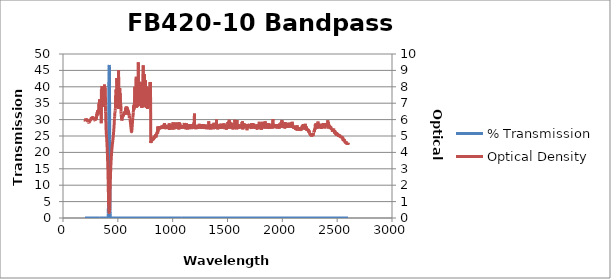
| Category | % Transmission |
|---|---|
| 2600.0 | 0.003 |
| 2599.0 | 0.003 |
| 2598.0 | 0.003 |
| 2597.0 | 0.003 |
| 2596.0 | 0.003 |
| 2595.0 | 0.003 |
| 2594.0 | 0.003 |
| 2593.0 | 0.003 |
| 2592.0 | 0.003 |
| 2591.0 | 0.003 |
| 2590.0 | 0.003 |
| 2589.0 | 0.003 |
| 2588.0 | 0.003 |
| 2587.0 | 0.003 |
| 2586.0 | 0.003 |
| 2585.0 | 0.003 |
| 2584.0 | 0.003 |
| 2583.0 | 0.003 |
| 2582.0 | 0.002 |
| 2581.0 | 0.002 |
| 2580.0 | 0.002 |
| 2579.0 | 0.003 |
| 2578.0 | 0.002 |
| 2577.0 | 0.003 |
| 2576.0 | 0.002 |
| 2575.0 | 0.003 |
| 2574.0 | 0.002 |
| 2573.0 | 0.002 |
| 2572.0 | 0.002 |
| 2571.0 | 0.002 |
| 2570.0 | 0.002 |
| 2569.0 | 0.002 |
| 2568.0 | 0.002 |
| 2567.0 | 0.002 |
| 2566.0 | 0.002 |
| 2565.0 | 0.002 |
| 2564.0 | 0.002 |
| 2563.0 | 0.002 |
| 2562.0 | 0.002 |
| 2561.0 | 0.002 |
| 2560.0 | 0.002 |
| 2559.0 | 0.002 |
| 2558.0 | 0.002 |
| 2557.0 | 0.002 |
| 2556.0 | 0.001 |
| 2555.0 | 0.001 |
| 2554.0 | 0.002 |
| 2553.0 | 0.001 |
| 2552.0 | 0.002 |
| 2551.0 | 0.002 |
| 2550.0 | 0.002 |
| 2549.0 | 0.001 |
| 2548.0 | 0.001 |
| 2547.0 | 0.001 |
| 2546.0 | 0.001 |
| 2545.0 | 0.001 |
| 2544.0 | 0.001 |
| 2543.0 | 0.001 |
| 2542.0 | 0.001 |
| 2541.0 | 0.001 |
| 2540.0 | 0.001 |
| 2539.0 | 0.001 |
| 2538.0 | 0.001 |
| 2537.0 | 0.001 |
| 2536.0 | 0.001 |
| 2535.0 | 0.001 |
| 2534.0 | 0.001 |
| 2533.0 | 0.001 |
| 2532.0 | 0.001 |
| 2531.0 | 0.001 |
| 2530.0 | 0.001 |
| 2529.0 | 0.001 |
| 2528.0 | 0.001 |
| 2527.0 | 0.001 |
| 2526.0 | 0.001 |
| 2525.0 | 0.001 |
| 2524.0 | 0.001 |
| 2523.0 | 0.001 |
| 2522.0 | 0.001 |
| 2521.0 | 0.001 |
| 2520.0 | 0.001 |
| 2519.0 | 0.001 |
| 2518.0 | 0.001 |
| 2517.0 | 0.001 |
| 2516.0 | 0.001 |
| 2515.0 | 0.001 |
| 2514.0 | 0.001 |
| 2513.0 | 0.001 |
| 2512.0 | 0.001 |
| 2511.0 | 0.001 |
| 2510.0 | 0.001 |
| 2509.0 | 0.001 |
| 2508.0 | 0.001 |
| 2507.0 | 0.001 |
| 2506.0 | 0.001 |
| 2505.0 | 0.001 |
| 2504.0 | 0.001 |
| 2503.0 | 0.001 |
| 2502.0 | 0.001 |
| 2501.0 | 0.001 |
| 2500.0 | 0.001 |
| 2499.0 | 0.001 |
| 2498.0 | 0.001 |
| 2497.0 | 0.001 |
| 2496.0 | 0.001 |
| 2495.0 | 0.001 |
| 2494.0 | 0.001 |
| 2493.0 | 0.001 |
| 2492.0 | 0.001 |
| 2491.0 | 0.001 |
| 2490.0 | 0.001 |
| 2489.0 | 0.001 |
| 2488.0 | 0.001 |
| 2487.0 | 0.001 |
| 2486.0 | 0.001 |
| 2485.0 | 0.001 |
| 2484.0 | 0.001 |
| 2483.0 | 0.001 |
| 2482.0 | 0.001 |
| 2481.0 | 0.001 |
| 2480.0 | 0.001 |
| 2479.0 | 0.001 |
| 2478.0 | 0 |
| 2477.0 | 0 |
| 2476.0 | 0.001 |
| 2475.0 | 0.001 |
| 2474.0 | 0 |
| 2473.0 | 0 |
| 2472.0 | 0.001 |
| 2471.0 | 0.001 |
| 2470.0 | 0 |
| 2469.0 | 0.001 |
| 2468.0 | 0 |
| 2467.0 | 0 |
| 2466.0 | 0.001 |
| 2465.0 | 0 |
| 2464.0 | 0 |
| 2463.0 | 0 |
| 2462.0 | 0 |
| 2461.0 | 0.001 |
| 2460.0 | 0.001 |
| 2459.0 | 0 |
| 2458.0 | 0.001 |
| 2457.0 | 0 |
| 2456.0 | 0 |
| 2455.0 | 0 |
| 2454.0 | 0 |
| 2453.0 | 0 |
| 2452.0 | 0 |
| 2451.0 | 0 |
| 2450.0 | 0 |
| 2449.0 | 0 |
| 2448.0 | 0 |
| 2447.0 | 0 |
| 2446.0 | 0 |
| 2445.0 | 0 |
| 2444.0 | 0 |
| 2443.0 | 0 |
| 2442.0 | 0 |
| 2441.0 | 0 |
| 2440.0 | 0 |
| 2439.0 | 0 |
| 2438.0 | 0 |
| 2437.0 | 0 |
| 2436.0 | 0 |
| 2435.0 | 0 |
| 2434.0 | 0 |
| 2433.0 | 0 |
| 2432.0 | 0 |
| 2431.0 | 0 |
| 2430.0 | 0 |
| 2429.0 | 0 |
| 2428.0 | 0 |
| 2427.0 | 0 |
| 2426.0 | 0 |
| 2425.0 | 0 |
| 2424.0 | 0 |
| 2423.0 | 0 |
| 2422.0 | 0 |
| 2421.0 | 0 |
| 2420.0 | 0 |
| 2419.0 | 0 |
| 2418.0 | 0 |
| 2417.0 | 0 |
| 2416.0 | 0 |
| 2415.0 | 0 |
| 2414.0 | 0 |
| 2413.0 | 0 |
| 2412.0 | 0 |
| 2411.0 | 0 |
| 2410.0 | 0 |
| 2409.0 | 0 |
| 2408.0 | 0 |
| 2407.0 | 0 |
| 2406.0 | 0 |
| 2405.0 | 0 |
| 2404.0 | 0 |
| 2403.0 | 0 |
| 2402.0 | 0 |
| 2401.0 | 0 |
| 2400.0 | 0 |
| 2399.0 | 0 |
| 2398.0 | 0 |
| 2397.0 | 0 |
| 2396.0 | 0 |
| 2395.0 | 0 |
| 2394.0 | 0 |
| 2393.0 | 0 |
| 2392.0 | 0 |
| 2391.0 | 0 |
| 2390.0 | 0 |
| 2389.0 | 0 |
| 2388.0 | 0 |
| 2387.0 | 0 |
| 2386.0 | 0 |
| 2385.0 | 0 |
| 2384.0 | 0 |
| 2383.0 | 0 |
| 2382.0 | 0 |
| 2381.0 | 0 |
| 2380.0 | 0 |
| 2379.0 | 0 |
| 2378.0 | 0 |
| 2377.0 | 0 |
| 2376.0 | 0 |
| 2375.0 | 0 |
| 2374.0 | 0 |
| 2373.0 | 0 |
| 2372.0 | 0 |
| 2371.0 | 0 |
| 2370.0 | 0 |
| 2369.0 | 0 |
| 2368.0 | 0 |
| 2367.0 | 0 |
| 2366.0 | 0 |
| 2365.0 | 0 |
| 2364.0 | 0 |
| 2363.0 | 0 |
| 2362.0 | 0 |
| 2361.0 | 0 |
| 2360.0 | 0 |
| 2359.0 | 0 |
| 2358.0 | 0 |
| 2357.0 | 0 |
| 2356.0 | 0 |
| 2355.0 | 0 |
| 2354.0 | 0 |
| 2353.0 | 0 |
| 2352.0 | 0 |
| 2351.0 | 0 |
| 2350.0 | 0 |
| 2349.0 | 0 |
| 2348.0 | 0 |
| 2347.0 | 0 |
| 2346.0 | 0 |
| 2345.0 | 0 |
| 2344.0 | 0 |
| 2343.0 | 0 |
| 2342.0 | 0 |
| 2341.0 | 0 |
| 2340.0 | 0 |
| 2339.0 | 0 |
| 2338.0 | 0 |
| 2337.0 | 0 |
| 2336.0 | 0 |
| 2335.0 | 0 |
| 2334.0 | 0 |
| 2333.0 | 0 |
| 2332.0 | 0 |
| 2331.0 | 0 |
| 2330.0 | 0 |
| 2329.0 | 0 |
| 2328.0 | 0 |
| 2327.0 | 0 |
| 2326.0 | 0 |
| 2325.0 | 0 |
| 2324.0 | 0 |
| 2323.0 | 0 |
| 2322.0 | 0 |
| 2321.0 | 0 |
| 2320.0 | 0 |
| 2319.0 | 0 |
| 2318.0 | 0 |
| 2317.0 | 0 |
| 2316.0 | 0 |
| 2315.0 | 0 |
| 2314.0 | 0 |
| 2313.0 | 0 |
| 2312.0 | 0 |
| 2311.0 | 0 |
| 2310.0 | 0 |
| 2309.0 | 0 |
| 2308.0 | 0 |
| 2307.0 | 0 |
| 2306.0 | 0 |
| 2305.0 | 0 |
| 2304.0 | 0 |
| 2303.0 | 0 |
| 2302.0 | 0 |
| 2301.0 | 0 |
| 2300.0 | 0 |
| 2299.0 | 0 |
| 2298.0 | 0 |
| 2297.0 | 0 |
| 2296.0 | 0 |
| 2295.0 | 0 |
| 2294.0 | 0 |
| 2293.0 | 0.001 |
| 2292.0 | 0 |
| 2291.0 | 0 |
| 2290.0 | 0.001 |
| 2289.0 | 0.001 |
| 2288.0 | 0.001 |
| 2287.0 | 0.001 |
| 2286.0 | 0.001 |
| 2285.0 | 0.001 |
| 2284.0 | 0.001 |
| 2283.0 | 0.001 |
| 2282.0 | 0.001 |
| 2281.0 | 0.001 |
| 2280.0 | 0.001 |
| 2279.0 | 0.001 |
| 2278.0 | 0.001 |
| 2277.0 | 0.001 |
| 2276.0 | 0.001 |
| 2275.0 | 0.001 |
| 2274.0 | 0.001 |
| 2273.0 | 0.001 |
| 2272.0 | 0.001 |
| 2271.0 | 0.001 |
| 2270.0 | 0.001 |
| 2269.0 | 0.001 |
| 2268.0 | 0.001 |
| 2267.0 | 0.001 |
| 2266.0 | 0.001 |
| 2265.0 | 0.001 |
| 2264.0 | 0.001 |
| 2263.0 | 0.001 |
| 2262.0 | 0.001 |
| 2261.0 | 0.001 |
| 2260.0 | 0.001 |
| 2259.0 | 0.001 |
| 2258.0 | 0.001 |
| 2257.0 | 0.001 |
| 2256.0 | 0.001 |
| 2255.0 | 0.001 |
| 2254.0 | 0.001 |
| 2253.0 | 0.001 |
| 2252.0 | 0.001 |
| 2251.0 | 0.001 |
| 2250.0 | 0.001 |
| 2249.0 | 0.001 |
| 2248.0 | 0.001 |
| 2247.0 | 0.001 |
| 2246.0 | 0.001 |
| 2245.0 | 0.001 |
| 2244.0 | 0.001 |
| 2243.0 | 0.001 |
| 2242.0 | 0.001 |
| 2241.0 | 0 |
| 2240.0 | 0.001 |
| 2239.0 | 0.001 |
| 2238.0 | 0.001 |
| 2237.0 | 0 |
| 2236.0 | 0 |
| 2235.0 | 0 |
| 2234.0 | 0 |
| 2233.0 | 0 |
| 2232.0 | 0.001 |
| 2231.0 | 0 |
| 2230.0 | 0 |
| 2229.0 | 0 |
| 2228.0 | 0 |
| 2227.0 | 0 |
| 2226.0 | 0 |
| 2225.0 | 0 |
| 2224.0 | 0 |
| 2223.0 | 0 |
| 2222.0 | 0 |
| 2221.0 | 0 |
| 2220.0 | 0 |
| 2219.0 | 0 |
| 2218.0 | 0 |
| 2217.0 | 0 |
| 2216.0 | 0 |
| 2215.0 | 0 |
| 2214.0 | 0 |
| 2213.0 | 0 |
| 2212.0 | 0 |
| 2211.0 | 0 |
| 2210.0 | 0 |
| 2209.0 | 0 |
| 2208.0 | 0 |
| 2207.0 | 0 |
| 2206.0 | 0 |
| 2205.0 | 0 |
| 2204.0 | 0 |
| 2203.0 | 0 |
| 2202.0 | 0 |
| 2201.0 | 0 |
| 2200.0 | 0 |
| 2199.0 | 0 |
| 2198.0 | 0 |
| 2197.0 | 0 |
| 2196.0 | 0 |
| 2195.0 | 0 |
| 2194.0 | 0 |
| 2193.0 | 0 |
| 2192.0 | 0 |
| 2191.0 | 0 |
| 2190.0 | 0 |
| 2189.0 | 0 |
| 2188.0 | 0 |
| 2187.0 | 0 |
| 2186.0 | 0 |
| 2185.0 | 0 |
| 2184.0 | 0 |
| 2183.0 | 0 |
| 2182.0 | 0 |
| 2181.0 | 0 |
| 2180.0 | 0 |
| 2179.0 | 0 |
| 2178.0 | 0 |
| 2177.0 | 0 |
| 2176.0 | 0 |
| 2175.0 | 0 |
| 2174.0 | 0 |
| 2173.0 | 0 |
| 2172.0 | 0 |
| 2171.0 | 0 |
| 2170.0 | 0 |
| 2169.0 | 0 |
| 2168.0 | 0 |
| 2167.0 | 0 |
| 2166.0 | 0 |
| 2165.0 | 0 |
| 2164.0 | 0 |
| 2163.0 | 0 |
| 2162.0 | 0 |
| 2161.0 | 0 |
| 2160.0 | 0 |
| 2159.0 | 0 |
| 2158.0 | 0 |
| 2157.0 | 0 |
| 2156.0 | 0 |
| 2155.0 | 0 |
| 2154.0 | 0 |
| 2153.0 | 0 |
| 2152.0 | 0 |
| 2151.0 | 0 |
| 2150.0 | 0 |
| 2149.0 | 0 |
| 2148.0 | 0 |
| 2147.0 | 0 |
| 2146.0 | 0 |
| 2145.0 | 0 |
| 2144.0 | 0 |
| 2143.0 | 0 |
| 2142.0 | 0 |
| 2141.0 | 0 |
| 2140.0 | 0 |
| 2139.0 | 0 |
| 2138.0 | 0 |
| 2137.0 | 0 |
| 2136.0 | 0 |
| 2135.0 | 0 |
| 2134.0 | 0 |
| 2133.0 | 0 |
| 2132.0 | 0 |
| 2131.0 | 0 |
| 2130.0 | 0 |
| 2129.0 | 0 |
| 2128.0 | 0 |
| 2127.0 | 0 |
| 2126.0 | 0 |
| 2125.0 | 0 |
| 2124.0 | 0 |
| 2123.0 | 0 |
| 2122.0 | 0 |
| 2121.0 | 0 |
| 2120.0 | 0 |
| 2119.0 | 0 |
| 2118.0 | 0 |
| 2117.0 | 0 |
| 2116.0 | 0 |
| 2115.0 | 0 |
| 2114.0 | 0 |
| 2113.0 | 0 |
| 2112.0 | 0 |
| 2111.0 | 0 |
| 2110.0 | 0 |
| 2109.0 | 0 |
| 2108.0 | 0 |
| 2107.0 | 0 |
| 2106.0 | 0 |
| 2105.0 | 0 |
| 2104.0 | 0 |
| 2103.0 | 0 |
| 2102.0 | 0 |
| 2101.0 | 0 |
| 2100.0 | 0 |
| 2099.0 | 0 |
| 2098.0 | 0 |
| 2097.0 | 0 |
| 2096.0 | 0 |
| 2095.0 | 0 |
| 2094.0 | 0 |
| 2093.0 | 0 |
| 2092.0 | 0 |
| 2091.0 | 0 |
| 2090.0 | 0 |
| 2089.0 | 0 |
| 2088.0 | 0 |
| 2087.0 | 0 |
| 2086.0 | 0 |
| 2085.0 | 0 |
| 2084.0 | 0 |
| 2083.0 | 0 |
| 2082.0 | 0 |
| 2081.0 | 0 |
| 2080.0 | 0 |
| 2079.0 | 0 |
| 2078.0 | 0 |
| 2077.0 | 0 |
| 2076.0 | 0 |
| 2075.0 | 0 |
| 2074.0 | 0 |
| 2073.0 | 0 |
| 2072.0 | 0 |
| 2071.0 | 0 |
| 2070.0 | 0 |
| 2069.0 | 0 |
| 2068.0 | 0 |
| 2067.0 | 0 |
| 2066.0 | 0 |
| 2065.0 | 0 |
| 2064.0 | 0 |
| 2063.0 | 0 |
| 2062.0 | 0 |
| 2061.0 | 0 |
| 2060.0 | 0 |
| 2059.0 | 0 |
| 2058.0 | 0 |
| 2057.0 | 0 |
| 2056.0 | 0 |
| 2055.0 | 0 |
| 2054.0 | 0 |
| 2053.0 | 0 |
| 2052.0 | 0 |
| 2051.0 | 0 |
| 2050.0 | 0 |
| 2049.0 | 0 |
| 2048.0 | 0 |
| 2047.0 | 0 |
| 2046.0 | 0 |
| 2045.0 | 0 |
| 2044.0 | 0 |
| 2043.0 | 0 |
| 2042.0 | 0 |
| 2041.0 | 0 |
| 2040.0 | 0 |
| 2039.0 | 0 |
| 2038.0 | 0 |
| 2037.0 | 0 |
| 2036.0 | 0 |
| 2035.0 | 0 |
| 2034.0 | 0 |
| 2033.0 | 0 |
| 2032.0 | 0 |
| 2031.0 | 0 |
| 2030.0 | 0 |
| 2029.0 | 0 |
| 2028.0 | 0 |
| 2027.0 | 0 |
| 2026.0 | 0 |
| 2025.0 | 0 |
| 2024.0 | 0 |
| 2023.0 | 0 |
| 2022.0 | 0 |
| 2021.0 | 0 |
| 2020.0 | 0 |
| 2019.0 | 0 |
| 2018.0 | 0 |
| 2017.0 | 0 |
| 2016.0 | 0 |
| 2015.0 | 0 |
| 2014.0 | 0 |
| 2013.0 | 0 |
| 2012.0 | 0 |
| 2011.0 | 0 |
| 2010.0 | 0 |
| 2009.0 | 0 |
| 2008.0 | 0 |
| 2007.0 | 0 |
| 2006.0 | 0 |
| 2005.0 | 0 |
| 2004.0 | 0 |
| 2003.0 | 0 |
| 2002.0 | 0 |
| 2001.0 | 0 |
| 2000.0 | 0 |
| 1999.0 | 0 |
| 1998.0 | 0 |
| 1997.0 | 0 |
| 1996.0 | 0 |
| 1995.0 | 0 |
| 1994.0 | 0 |
| 1993.0 | 0 |
| 1992.0 | 0 |
| 1991.0 | 0 |
| 1990.0 | 0 |
| 1989.0 | 0 |
| 1988.0 | 0 |
| 1987.0 | 0 |
| 1986.0 | 0 |
| 1985.0 | 0 |
| 1984.0 | 0 |
| 1983.0 | 0 |
| 1982.0 | 0 |
| 1981.0 | 0 |
| 1980.0 | 0 |
| 1979.0 | 0 |
| 1978.0 | 0 |
| 1977.0 | 0 |
| 1976.0 | 0 |
| 1975.0 | 0 |
| 1974.0 | 0 |
| 1973.0 | 0 |
| 1972.0 | 0 |
| 1971.0 | 0 |
| 1970.0 | 0 |
| 1969.0 | 0 |
| 1968.0 | 0 |
| 1967.0 | 0 |
| 1966.0 | 0 |
| 1965.0 | 0 |
| 1964.0 | 0 |
| 1963.0 | 0 |
| 1962.0 | 0 |
| 1961.0 | 0 |
| 1960.0 | 0 |
| 1959.0 | 0 |
| 1958.0 | 0 |
| 1957.0 | 0 |
| 1956.0 | 0 |
| 1955.0 | 0 |
| 1954.0 | 0 |
| 1953.0 | 0 |
| 1952.0 | 0 |
| 1951.0 | 0 |
| 1950.0 | 0 |
| 1949.0 | 0 |
| 1948.0 | 0 |
| 1947.0 | 0 |
| 1946.0 | 0 |
| 1945.0 | 0 |
| 1944.0 | 0 |
| 1943.0 | 0 |
| 1942.0 | 0 |
| 1941.0 | 0 |
| 1940.0 | 0 |
| 1939.0 | 0 |
| 1938.0 | 0 |
| 1937.0 | 0 |
| 1936.0 | 0 |
| 1935.0 | 0 |
| 1934.0 | 0 |
| 1933.0 | 0 |
| 1932.0 | 0 |
| 1931.0 | 0 |
| 1930.0 | 0 |
| 1929.0 | 0 |
| 1928.0 | 0 |
| 1927.0 | 0 |
| 1926.0 | 0 |
| 1925.0 | 0 |
| 1924.0 | 0 |
| 1923.0 | 0 |
| 1922.0 | 0 |
| 1921.0 | 0 |
| 1920.0 | 0 |
| 1919.0 | 0 |
| 1918.0 | 0 |
| 1917.0 | 0 |
| 1916.0 | 0 |
| 1915.0 | 0 |
| 1914.0 | 0 |
| 1913.0 | 0 |
| 1912.0 | 0 |
| 1911.0 | 0 |
| 1910.0 | 0 |
| 1909.0 | 0 |
| 1908.0 | 0 |
| 1907.0 | 0 |
| 1906.0 | 0 |
| 1905.0 | 0 |
| 1904.0 | 0 |
| 1903.0 | 0 |
| 1902.0 | 0 |
| 1901.0 | 0 |
| 1900.0 | 0 |
| 1899.0 | 0 |
| 1898.0 | 0 |
| 1897.0 | 0 |
| 1896.0 | 0 |
| 1895.0 | 0 |
| 1894.0 | 0 |
| 1893.0 | 0 |
| 1892.0 | 0 |
| 1891.0 | 0 |
| 1890.0 | 0 |
| 1889.0 | 0 |
| 1888.0 | 0 |
| 1887.0 | 0 |
| 1886.0 | 0 |
| 1885.0 | 0 |
| 1884.0 | 0 |
| 1883.0 | 0 |
| 1882.0 | 0 |
| 1881.0 | 0 |
| 1880.0 | 0 |
| 1879.0 | 0 |
| 1878.0 | 0 |
| 1877.0 | 0 |
| 1876.0 | 0 |
| 1875.0 | 0 |
| 1874.0 | 0 |
| 1873.0 | 0 |
| 1872.0 | 0 |
| 1871.0 | 0 |
| 1870.0 | 0 |
| 1869.0 | 0 |
| 1868.0 | 0 |
| 1867.0 | 0 |
| 1866.0 | 0 |
| 1865.0 | 0 |
| 1864.0 | 0 |
| 1863.0 | 0 |
| 1862.0 | 0 |
| 1861.0 | 0 |
| 1860.0 | 0 |
| 1859.0 | 0 |
| 1858.0 | 0 |
| 1857.0 | 0 |
| 1856.0 | 0 |
| 1855.0 | 0 |
| 1854.0 | 0 |
| 1853.0 | 0 |
| 1852.0 | 0 |
| 1851.0 | 0 |
| 1850.0 | 0 |
| 1849.0 | 0 |
| 1848.0 | 0 |
| 1847.0 | 0 |
| 1846.0 | 0 |
| 1845.0 | 0 |
| 1844.0 | 0 |
| 1843.0 | 0 |
| 1842.0 | 0 |
| 1841.0 | 0 |
| 1840.0 | 0 |
| 1839.0 | 0 |
| 1838.0 | 0 |
| 1837.0 | 0 |
| 1836.0 | 0 |
| 1835.0 | 0 |
| 1834.0 | 0 |
| 1833.0 | 0 |
| 1832.0 | 0 |
| 1831.0 | 0 |
| 1830.0 | 0 |
| 1829.0 | 0 |
| 1828.0 | 0 |
| 1827.0 | 0 |
| 1826.0 | 0 |
| 1825.0 | 0 |
| 1824.0 | 0 |
| 1823.0 | 0 |
| 1822.0 | 0 |
| 1821.0 | 0 |
| 1820.0 | 0 |
| 1819.0 | 0 |
| 1818.0 | 0 |
| 1817.0 | 0 |
| 1816.0 | 0 |
| 1815.0 | 0 |
| 1814.0 | 0 |
| 1813.0 | 0 |
| 1812.0 | 0 |
| 1811.0 | 0 |
| 1810.0 | 0 |
| 1809.0 | 0 |
| 1808.0 | 0 |
| 1807.0 | 0 |
| 1806.0 | 0 |
| 1805.0 | 0 |
| 1804.0 | 0 |
| 1803.0 | 0 |
| 1802.0 | 0 |
| 1801.0 | 0 |
| 1800.0 | 0 |
| 1799.0 | 0 |
| 1798.0 | 0 |
| 1797.0 | 0 |
| 1796.0 | 0 |
| 1795.0 | 0 |
| 1794.0 | 0 |
| 1793.0 | 0 |
| 1792.0 | 0 |
| 1791.0 | 0 |
| 1790.0 | 0 |
| 1789.0 | 0 |
| 1788.0 | 0 |
| 1787.0 | 0 |
| 1786.0 | 0 |
| 1785.0 | 0 |
| 1784.0 | 0 |
| 1783.0 | 0 |
| 1782.0 | 0 |
| 1781.0 | 0 |
| 1780.0 | 0 |
| 1779.0 | 0 |
| 1778.0 | 0 |
| 1777.0 | 0 |
| 1776.0 | 0 |
| 1775.0 | 0 |
| 1774.0 | 0 |
| 1773.0 | 0 |
| 1772.0 | 0 |
| 1771.0 | 0 |
| 1770.0 | 0 |
| 1769.0 | 0 |
| 1768.0 | 0 |
| 1767.0 | 0 |
| 1766.0 | 0 |
| 1765.0 | 0 |
| 1764.0 | 0 |
| 1763.0 | 0 |
| 1762.0 | 0 |
| 1761.0 | 0 |
| 1760.0 | 0 |
| 1759.0 | 0 |
| 1758.0 | 0 |
| 1757.0 | 0 |
| 1756.0 | 0 |
| 1755.0 | 0 |
| 1754.0 | 0 |
| 1753.0 | 0 |
| 1752.0 | 0 |
| 1751.0 | 0 |
| 1750.0 | 0 |
| 1749.0 | 0 |
| 1748.0 | 0 |
| 1747.0 | 0 |
| 1746.0 | 0 |
| 1745.0 | 0 |
| 1744.0 | 0 |
| 1743.0 | 0 |
| 1742.0 | 0 |
| 1741.0 | 0 |
| 1740.0 | 0 |
| 1739.0 | 0 |
| 1738.0 | 0 |
| 1737.0 | 0 |
| 1736.0 | 0 |
| 1735.0 | 0 |
| 1734.0 | 0 |
| 1733.0 | 0 |
| 1732.0 | 0 |
| 1731.0 | 0 |
| 1730.0 | 0 |
| 1729.0 | 0 |
| 1728.0 | 0 |
| 1727.0 | 0 |
| 1726.0 | 0 |
| 1725.0 | 0 |
| 1724.0 | 0 |
| 1723.0 | 0 |
| 1722.0 | 0 |
| 1721.0 | 0 |
| 1720.0 | 0 |
| 1719.0 | 0 |
| 1718.0 | 0 |
| 1717.0 | 0 |
| 1716.0 | 0 |
| 1715.0 | 0 |
| 1714.0 | 0 |
| 1713.0 | 0 |
| 1712.0 | 0 |
| 1711.0 | 0 |
| 1710.0 | 0 |
| 1709.0 | 0 |
| 1708.0 | 0 |
| 1707.0 | 0 |
| 1706.0 | 0 |
| 1705.0 | 0 |
| 1704.0 | 0 |
| 1703.0 | 0 |
| 1702.0 | 0 |
| 1701.0 | 0 |
| 1700.0 | 0 |
| 1699.0 | 0 |
| 1698.0 | 0 |
| 1697.0 | 0 |
| 1696.0 | 0 |
| 1695.0 | 0 |
| 1694.0 | 0 |
| 1693.0 | 0 |
| 1692.0 | 0 |
| 1691.0 | 0 |
| 1690.0 | 0 |
| 1689.0 | 0 |
| 1688.0 | 0 |
| 1687.0 | 0 |
| 1686.0 | 0 |
| 1685.0 | 0 |
| 1684.0 | 0 |
| 1683.0 | 0 |
| 1682.0 | 0 |
| 1681.0 | 0 |
| 1680.0 | 0 |
| 1679.0 | 0 |
| 1678.0 | 0 |
| 1677.0 | 0 |
| 1676.0 | 0 |
| 1675.0 | 0 |
| 1674.0 | 0 |
| 1673.0 | 0 |
| 1672.0 | 0 |
| 1671.0 | 0 |
| 1670.0 | 0 |
| 1669.0 | 0 |
| 1668.0 | 0 |
| 1667.0 | 0 |
| 1666.0 | 0 |
| 1665.0 | 0 |
| 1664.0 | 0 |
| 1663.0 | 0 |
| 1662.0 | 0 |
| 1661.0 | 0 |
| 1660.0 | 0 |
| 1659.0 | 0 |
| 1658.0 | 0 |
| 1657.0 | 0 |
| 1656.0 | 0 |
| 1655.0 | 0 |
| 1654.0 | 0 |
| 1653.0 | 0 |
| 1652.0 | 0 |
| 1651.0 | 0 |
| 1650.0 | 0 |
| 1649.0 | 0 |
| 1648.0 | 0 |
| 1647.0 | 0 |
| 1646.0 | 0 |
| 1645.0 | 0 |
| 1644.0 | 0 |
| 1643.0 | 0 |
| 1642.0 | 0 |
| 1641.0 | 0 |
| 1640.0 | 0 |
| 1639.0 | 0 |
| 1638.0 | 0 |
| 1637.0 | 0 |
| 1636.0 | 0 |
| 1635.0 | 0 |
| 1634.0 | 0 |
| 1633.0 | 0 |
| 1632.0 | 0 |
| 1631.0 | 0 |
| 1630.0 | 0 |
| 1629.0 | 0 |
| 1628.0 | 0 |
| 1627.0 | 0 |
| 1626.0 | 0 |
| 1625.0 | 0 |
| 1624.0 | 0 |
| 1623.0 | 0 |
| 1622.0 | 0 |
| 1621.0 | 0 |
| 1620.0 | 0 |
| 1619.0 | 0 |
| 1618.0 | 0 |
| 1617.0 | 0 |
| 1616.0 | 0 |
| 1615.0 | 0 |
| 1614.0 | 0 |
| 1613.0 | 0 |
| 1612.0 | 0 |
| 1611.0 | 0 |
| 1610.0 | 0 |
| 1609.0 | 0 |
| 1608.0 | 0 |
| 1607.0 | 0 |
| 1606.0 | 0 |
| 1605.0 | 0 |
| 1604.0 | 0 |
| 1603.0 | 0 |
| 1602.0 | 0 |
| 1601.0 | 0 |
| 1600.0 | 0 |
| 1599.0 | 0 |
| 1598.0 | 0 |
| 1597.0 | 0 |
| 1596.0 | 0 |
| 1595.0 | 0 |
| 1594.0 | 0 |
| 1593.0 | 0 |
| 1592.0 | 0 |
| 1591.0 | 0 |
| 1590.0 | 0 |
| 1589.0 | 0 |
| 1588.0 | 0 |
| 1587.0 | 0 |
| 1586.0 | 0 |
| 1585.0 | 0 |
| 1584.0 | 0 |
| 1583.0 | 0 |
| 1582.0 | 0 |
| 1581.0 | 0 |
| 1580.0 | 0 |
| 1579.0 | 0 |
| 1578.0 | 0 |
| 1577.0 | 0 |
| 1576.0 | 0 |
| 1575.0 | 0 |
| 1574.0 | 0 |
| 1573.0 | 0 |
| 1572.0 | 0 |
| 1571.0 | 0 |
| 1570.0 | 0 |
| 1569.0 | 0 |
| 1568.0 | 0 |
| 1567.0 | 0 |
| 1566.0 | 0 |
| 1565.0 | 0 |
| 1564.0 | 0 |
| 1563.0 | 0 |
| 1562.0 | 0 |
| 1561.0 | 0 |
| 1560.0 | 0 |
| 1559.0 | 0 |
| 1558.0 | 0 |
| 1557.0 | 0 |
| 1556.0 | 0 |
| 1555.0 | 0 |
| 1554.0 | 0 |
| 1553.0 | 0 |
| 1552.0 | 0 |
| 1551.0 | 0 |
| 1550.0 | 0 |
| 1549.0 | 0 |
| 1548.0 | 0 |
| 1547.0 | 0 |
| 1546.0 | 0 |
| 1545.0 | 0 |
| 1544.0 | 0 |
| 1543.0 | 0 |
| 1542.0 | 0 |
| 1541.0 | 0 |
| 1540.0 | 0 |
| 1539.0 | 0 |
| 1538.0 | 0 |
| 1537.0 | 0 |
| 1536.0 | 0 |
| 1535.0 | 0 |
| 1534.0 | 0 |
| 1533.0 | 0 |
| 1532.0 | 0 |
| 1531.0 | 0 |
| 1530.0 | 0 |
| 1529.0 | 0 |
| 1528.0 | 0 |
| 1527.0 | 0 |
| 1526.0 | 0 |
| 1525.0 | 0 |
| 1524.0 | 0 |
| 1523.0 | 0 |
| 1522.0 | 0 |
| 1521.0 | 0 |
| 1520.0 | 0 |
| 1519.0 | 0 |
| 1518.0 | 0 |
| 1517.0 | 0 |
| 1516.0 | 0 |
| 1515.0 | 0 |
| 1514.0 | 0 |
| 1513.0 | 0 |
| 1512.0 | 0 |
| 1511.0 | 0 |
| 1510.0 | 0 |
| 1509.0 | 0 |
| 1508.0 | 0 |
| 1507.0 | 0 |
| 1506.0 | 0 |
| 1505.0 | 0 |
| 1504.0 | 0 |
| 1503.0 | 0 |
| 1502.0 | 0 |
| 1501.0 | 0 |
| 1500.0 | 0 |
| 1499.0 | 0 |
| 1498.0 | 0 |
| 1497.0 | 0 |
| 1496.0 | 0 |
| 1495.0 | 0 |
| 1494.0 | 0 |
| 1493.0 | 0 |
| 1492.0 | 0 |
| 1491.0 | 0 |
| 1490.0 | 0 |
| 1489.0 | 0 |
| 1488.0 | 0 |
| 1487.0 | 0 |
| 1486.0 | 0 |
| 1485.0 | 0 |
| 1484.0 | 0 |
| 1483.0 | 0 |
| 1482.0 | 0 |
| 1481.0 | 0 |
| 1480.0 | 0 |
| 1479.0 | 0 |
| 1478.0 | 0 |
| 1477.0 | 0 |
| 1476.0 | 0 |
| 1475.0 | 0 |
| 1474.0 | 0 |
| 1473.0 | 0 |
| 1472.0 | 0 |
| 1471.0 | 0 |
| 1470.0 | 0 |
| 1469.0 | 0 |
| 1468.0 | 0 |
| 1467.0 | 0 |
| 1466.0 | 0 |
| 1465.0 | 0 |
| 1464.0 | 0 |
| 1463.0 | 0 |
| 1462.0 | 0 |
| 1461.0 | 0 |
| 1460.0 | 0 |
| 1459.0 | 0 |
| 1458.0 | 0 |
| 1457.0 | 0 |
| 1456.0 | 0 |
| 1455.0 | 0 |
| 1454.0 | 0 |
| 1453.0 | 0 |
| 1452.0 | 0 |
| 1451.0 | 0 |
| 1450.0 | 0 |
| 1449.0 | 0 |
| 1448.0 | 0 |
| 1447.0 | 0 |
| 1446.0 | 0 |
| 1445.0 | 0 |
| 1444.0 | 0 |
| 1443.0 | 0 |
| 1442.0 | 0 |
| 1441.0 | 0 |
| 1440.0 | 0 |
| 1439.0 | 0 |
| 1438.0 | 0 |
| 1437.0 | 0 |
| 1436.0 | 0 |
| 1435.0 | 0 |
| 1434.0 | 0 |
| 1433.0 | 0 |
| 1432.0 | 0 |
| 1431.0 | 0 |
| 1430.0 | 0 |
| 1429.0 | 0 |
| 1428.0 | 0 |
| 1427.0 | 0 |
| 1426.0 | 0 |
| 1425.0 | 0 |
| 1424.0 | 0 |
| 1423.0 | 0 |
| 1422.0 | 0 |
| 1421.0 | 0 |
| 1420.0 | 0 |
| 1419.0 | 0 |
| 1418.0 | 0 |
| 1417.0 | 0 |
| 1416.0 | 0 |
| 1415.0 | 0 |
| 1414.0 | 0 |
| 1413.0 | 0 |
| 1412.0 | 0 |
| 1411.0 | 0 |
| 1410.0 | 0 |
| 1409.0 | 0 |
| 1408.0 | 0 |
| 1407.0 | 0 |
| 1406.0 | 0 |
| 1405.0 | 0 |
| 1404.0 | 0 |
| 1403.0 | 0 |
| 1402.0 | 0 |
| 1401.0 | 0 |
| 1400.0 | 0 |
| 1399.0 | 0 |
| 1398.0 | 0 |
| 1397.0 | 0 |
| 1396.0 | 0 |
| 1395.0 | 0 |
| 1394.0 | 0 |
| 1393.0 | 0 |
| 1392.0 | 0 |
| 1391.0 | 0 |
| 1390.0 | 0 |
| 1389.0 | 0 |
| 1388.0 | 0 |
| 1387.0 | 0 |
| 1386.0 | 0 |
| 1385.0 | 0 |
| 1384.0 | 0 |
| 1383.0 | 0 |
| 1382.0 | 0 |
| 1381.0 | 0 |
| 1380.0 | 0 |
| 1379.0 | 0 |
| 1378.0 | 0 |
| 1377.0 | 0 |
| 1376.0 | 0 |
| 1375.0 | 0 |
| 1374.0 | 0 |
| 1373.0 | 0 |
| 1372.0 | 0 |
| 1371.0 | 0 |
| 1370.0 | 0 |
| 1369.0 | 0 |
| 1368.0 | 0 |
| 1367.0 | 0 |
| 1366.0 | 0 |
| 1365.0 | 0 |
| 1364.0 | 0 |
| 1363.0 | 0 |
| 1362.0 | 0 |
| 1361.0 | 0 |
| 1360.0 | 0 |
| 1359.0 | 0 |
| 1358.0 | 0 |
| 1357.0 | 0 |
| 1356.0 | 0 |
| 1355.0 | 0 |
| 1354.0 | 0 |
| 1353.0 | 0 |
| 1352.0 | 0 |
| 1351.0 | 0 |
| 1350.0 | 0 |
| 1349.0 | 0 |
| 1348.0 | 0 |
| 1347.0 | 0 |
| 1346.0 | 0 |
| 1345.0 | 0 |
| 1344.0 | 0 |
| 1343.0 | 0 |
| 1342.0 | 0 |
| 1341.0 | 0 |
| 1340.0 | 0 |
| 1339.0 | 0 |
| 1338.0 | 0 |
| 1337.0 | 0 |
| 1336.0 | 0 |
| 1335.0 | 0 |
| 1334.0 | 0 |
| 1333.0 | 0 |
| 1332.0 | 0 |
| 1331.0 | 0 |
| 1330.0 | 0 |
| 1329.0 | 0 |
| 1328.0 | 0 |
| 1327.0 | 0 |
| 1326.0 | 0 |
| 1325.0 | 0 |
| 1324.0 | 0 |
| 1323.0 | 0 |
| 1322.0 | 0 |
| 1321.0 | 0 |
| 1320.0 | 0 |
| 1319.0 | 0 |
| 1318.0 | 0 |
| 1317.0 | 0 |
| 1316.0 | 0 |
| 1315.0 | 0 |
| 1314.0 | 0 |
| 1313.0 | 0 |
| 1312.0 | 0 |
| 1311.0 | 0 |
| 1310.0 | 0 |
| 1309.0 | 0 |
| 1308.0 | 0 |
| 1307.0 | 0 |
| 1306.0 | 0 |
| 1305.0 | 0 |
| 1304.0 | 0 |
| 1303.0 | 0 |
| 1302.0 | 0 |
| 1301.0 | 0 |
| 1300.0 | 0 |
| 1299.0 | 0 |
| 1298.0 | 0 |
| 1297.0 | 0 |
| 1296.0 | 0 |
| 1295.0 | 0 |
| 1294.0 | 0 |
| 1293.0 | 0 |
| 1292.0 | 0 |
| 1291.0 | 0 |
| 1290.0 | 0 |
| 1289.0 | 0 |
| 1288.0 | 0 |
| 1287.0 | 0 |
| 1286.0 | 0 |
| 1285.0 | 0 |
| 1284.0 | 0 |
| 1283.0 | 0 |
| 1282.0 | 0 |
| 1281.0 | 0 |
| 1280.0 | 0 |
| 1279.0 | 0 |
| 1278.0 | 0 |
| 1277.0 | 0 |
| 1276.0 | 0 |
| 1275.0 | 0 |
| 1274.0 | 0 |
| 1273.0 | 0 |
| 1272.0 | 0 |
| 1271.0 | 0 |
| 1270.0 | 0 |
| 1269.0 | 0 |
| 1268.0 | 0 |
| 1267.0 | 0 |
| 1266.0 | 0 |
| 1265.0 | 0 |
| 1264.0 | 0 |
| 1263.0 | 0 |
| 1262.0 | 0 |
| 1261.0 | 0 |
| 1260.0 | 0 |
| 1259.0 | 0 |
| 1258.0 | 0 |
| 1257.0 | 0 |
| 1256.0 | 0 |
| 1255.0 | 0 |
| 1254.0 | 0 |
| 1253.0 | 0 |
| 1252.0 | 0 |
| 1251.0 | 0 |
| 1250.0 | 0 |
| 1249.0 | 0 |
| 1248.0 | 0 |
| 1247.0 | 0 |
| 1246.0 | 0 |
| 1245.0 | 0 |
| 1244.0 | 0 |
| 1243.0 | 0 |
| 1242.0 | 0 |
| 1241.0 | 0 |
| 1240.0 | 0 |
| 1239.0 | 0 |
| 1238.0 | 0 |
| 1237.0 | 0 |
| 1236.0 | 0 |
| 1235.0 | 0 |
| 1234.0 | 0 |
| 1233.0 | 0 |
| 1232.0 | 0 |
| 1231.0 | 0 |
| 1230.0 | 0 |
| 1229.0 | 0 |
| 1228.0 | 0 |
| 1227.0 | 0 |
| 1226.0 | 0 |
| 1225.0 | 0 |
| 1224.0 | 0 |
| 1223.0 | 0 |
| 1222.0 | 0 |
| 1221.0 | 0 |
| 1220.0 | 0 |
| 1219.0 | 0 |
| 1218.0 | 0 |
| 1217.0 | 0 |
| 1216.0 | 0 |
| 1215.0 | 0 |
| 1214.0 | 0 |
| 1213.0 | 0 |
| 1212.0 | 0 |
| 1211.0 | 0 |
| 1210.0 | 0 |
| 1209.0 | 0 |
| 1208.0 | 0 |
| 1207.0 | 0 |
| 1206.0 | 0 |
| 1205.0 | 0 |
| 1204.0 | 0 |
| 1203.0 | 0 |
| 1202.0 | 0 |
| 1201.0 | 0 |
| 1200.0 | 0 |
| 1199.0 | 0 |
| 1198.0 | 0 |
| 1197.0 | 0 |
| 1196.0 | 0 |
| 1195.0 | 0 |
| 1194.0 | 0 |
| 1193.0 | 0 |
| 1192.0 | 0 |
| 1191.0 | 0 |
| 1190.0 | 0 |
| 1189.0 | 0 |
| 1188.0 | 0 |
| 1187.0 | 0 |
| 1186.0 | 0 |
| 1185.0 | 0 |
| 1184.0 | 0 |
| 1183.0 | 0 |
| 1182.0 | 0 |
| 1181.0 | 0 |
| 1180.0 | 0 |
| 1179.0 | 0 |
| 1178.0 | 0 |
| 1177.0 | 0 |
| 1176.0 | 0 |
| 1175.0 | 0 |
| 1174.0 | 0 |
| 1173.0 | 0 |
| 1172.0 | 0 |
| 1171.0 | 0 |
| 1170.0 | 0 |
| 1169.0 | 0 |
| 1168.0 | 0 |
| 1167.0 | 0 |
| 1166.0 | 0 |
| 1165.0 | 0 |
| 1164.0 | 0 |
| 1163.0 | 0 |
| 1162.0 | 0 |
| 1161.0 | 0 |
| 1160.0 | 0 |
| 1159.0 | 0 |
| 1158.0 | 0 |
| 1157.0 | 0 |
| 1156.0 | 0 |
| 1155.0 | 0 |
| 1154.0 | 0 |
| 1153.0 | 0 |
| 1152.0 | 0 |
| 1151.0 | 0 |
| 1150.0 | 0 |
| 1149.0 | 0 |
| 1148.0 | 0 |
| 1147.0 | 0 |
| 1146.0 | 0 |
| 1145.0 | 0 |
| 1144.0 | 0 |
| 1143.0 | 0 |
| 1142.0 | 0 |
| 1141.0 | 0 |
| 1140.0 | 0 |
| 1139.0 | 0 |
| 1138.0 | 0 |
| 1137.0 | 0 |
| 1136.0 | 0 |
| 1135.0 | 0 |
| 1134.0 | 0 |
| 1133.0 | 0 |
| 1132.0 | 0 |
| 1131.0 | 0 |
| 1130.0 | 0 |
| 1129.0 | 0 |
| 1128.0 | 0 |
| 1127.0 | 0 |
| 1126.0 | 0 |
| 1125.0 | 0 |
| 1124.0 | 0 |
| 1123.0 | 0 |
| 1122.0 | 0 |
| 1121.0 | 0 |
| 1120.0 | 0 |
| 1119.0 | 0 |
| 1118.0 | 0 |
| 1117.0 | 0 |
| 1116.0 | 0 |
| 1115.0 | 0 |
| 1114.0 | 0 |
| 1113.0 | 0 |
| 1112.0 | 0 |
| 1111.0 | 0 |
| 1110.0 | 0 |
| 1109.0 | 0 |
| 1108.0 | 0 |
| 1107.0 | 0 |
| 1106.0 | 0 |
| 1105.0 | 0 |
| 1104.0 | 0 |
| 1103.0 | 0 |
| 1102.0 | 0 |
| 1101.0 | 0 |
| 1100.0 | 0 |
| 1099.0 | 0 |
| 1098.0 | 0 |
| 1097.0 | 0 |
| 1096.0 | 0 |
| 1095.0 | 0 |
| 1094.0 | 0 |
| 1093.0 | 0 |
| 1092.0 | 0 |
| 1091.0 | 0 |
| 1090.0 | 0 |
| 1089.0 | 0 |
| 1088.0 | 0 |
| 1087.0 | 0 |
| 1086.0 | 0 |
| 1085.0 | 0 |
| 1084.0 | 0 |
| 1083.0 | 0 |
| 1082.0 | 0 |
| 1081.0 | 0 |
| 1080.0 | 0 |
| 1079.0 | 0 |
| 1078.0 | 0 |
| 1077.0 | 0 |
| 1076.0 | 0 |
| 1075.0 | 0 |
| 1074.0 | 0 |
| 1073.0 | 0 |
| 1072.0 | 0 |
| 1071.0 | 0 |
| 1070.0 | 0 |
| 1069.0 | 0 |
| 1068.0 | 0 |
| 1067.0 | 0 |
| 1066.0 | 0 |
| 1065.0 | 0 |
| 1064.0 | 0 |
| 1063.0 | 0 |
| 1062.0 | 0 |
| 1061.0 | 0 |
| 1060.0 | 0 |
| 1059.0 | 0 |
| 1058.0 | 0 |
| 1057.0 | 0 |
| 1056.0 | 0 |
| 1055.0 | 0 |
| 1054.0 | 0 |
| 1053.0 | 0 |
| 1052.0 | 0 |
| 1051.0 | 0 |
| 1050.0 | 0 |
| 1049.0 | 0 |
| 1048.0 | 0 |
| 1047.0 | 0 |
| 1046.0 | 0 |
| 1045.0 | 0 |
| 1044.0 | 0 |
| 1043.0 | 0 |
| 1042.0 | 0 |
| 1041.0 | 0 |
| 1040.0 | 0 |
| 1039.0 | 0 |
| 1038.0 | 0 |
| 1037.0 | 0 |
| 1036.0 | 0 |
| 1035.0 | 0 |
| 1034.0 | 0 |
| 1033.0 | 0 |
| 1032.0 | 0 |
| 1031.0 | 0 |
| 1030.0 | 0 |
| 1029.0 | 0 |
| 1028.0 | 0 |
| 1027.0 | 0 |
| 1026.0 | 0 |
| 1025.0 | 0 |
| 1024.0 | 0 |
| 1023.0 | 0 |
| 1022.0 | 0 |
| 1021.0 | 0 |
| 1020.0 | 0 |
| 1019.0 | 0 |
| 1018.0 | 0 |
| 1017.0 | 0 |
| 1016.0 | 0 |
| 1015.0 | 0 |
| 1014.0 | 0 |
| 1013.0 | 0 |
| 1012.0 | 0 |
| 1011.0 | 0 |
| 1010.0 | 0 |
| 1009.0 | 0 |
| 1008.0 | 0 |
| 1007.0 | 0 |
| 1006.0 | 0 |
| 1005.0 | 0 |
| 1004.0 | 0 |
| 1003.0 | 0 |
| 1002.0 | 0 |
| 1001.0 | 0 |
| 1000.0 | 0 |
| 999.0 | 0 |
| 998.0 | 0 |
| 997.0 | 0 |
| 996.0 | 0 |
| 995.0 | 0 |
| 994.0 | 0 |
| 993.0 | 0 |
| 992.0 | 0 |
| 991.0 | 0 |
| 990.0 | 0 |
| 989.0 | 0 |
| 988.0 | 0 |
| 987.0 | 0 |
| 986.0 | 0 |
| 985.0 | 0 |
| 984.0 | 0 |
| 983.0 | 0 |
| 982.0 | 0 |
| 981.0 | 0 |
| 980.0 | 0 |
| 979.0 | 0 |
| 978.0 | 0 |
| 977.0 | 0 |
| 976.0 | 0 |
| 975.0 | 0 |
| 974.0 | 0 |
| 973.0 | 0 |
| 972.0 | 0 |
| 971.0 | 0 |
| 970.0 | 0 |
| 969.0 | 0 |
| 968.0 | 0 |
| 967.0 | 0 |
| 966.0 | 0 |
| 965.0 | 0 |
| 964.0 | 0 |
| 963.0 | 0 |
| 962.0 | 0 |
| 961.0 | 0 |
| 960.0 | 0 |
| 959.0 | 0 |
| 958.0 | 0 |
| 957.0 | 0 |
| 956.0 | 0 |
| 955.0 | 0 |
| 954.0 | 0 |
| 953.0 | 0 |
| 952.0 | 0 |
| 951.0 | 0 |
| 950.0 | 0 |
| 949.0 | 0 |
| 948.0 | 0 |
| 947.0 | 0 |
| 946.0 | 0 |
| 945.0 | 0 |
| 944.0 | 0 |
| 943.0 | 0 |
| 942.0 | 0 |
| 941.0 | 0 |
| 940.0 | 0 |
| 939.0 | 0 |
| 938.0 | 0 |
| 937.0 | 0 |
| 936.0 | 0 |
| 935.0 | 0 |
| 934.0 | 0 |
| 933.0 | 0 |
| 932.0 | 0 |
| 931.0 | 0 |
| 930.0 | 0 |
| 929.0 | 0 |
| 928.0 | 0 |
| 927.0 | 0 |
| 926.0 | 0 |
| 925.0 | 0 |
| 924.0 | 0 |
| 923.0 | 0 |
| 922.0 | 0 |
| 921.0 | 0 |
| 920.0 | 0 |
| 919.0 | 0 |
| 918.0 | 0 |
| 917.0 | 0 |
| 916.0 | 0 |
| 915.0 | 0 |
| 914.0 | 0 |
| 913.0 | 0 |
| 912.0 | 0 |
| 911.0 | 0 |
| 910.0 | 0 |
| 909.0 | 0 |
| 908.0 | 0 |
| 907.0 | 0 |
| 906.0 | 0 |
| 905.0 | 0 |
| 904.0 | 0 |
| 903.0 | 0 |
| 902.0 | 0 |
| 901.0 | 0 |
| 900.0 | 0 |
| 899.0 | 0 |
| 898.0 | 0 |
| 897.0 | 0 |
| 896.0 | 0 |
| 895.0 | 0 |
| 894.0 | 0 |
| 893.0 | 0 |
| 892.0 | 0 |
| 891.0 | 0 |
| 890.0 | 0 |
| 889.0 | 0 |
| 888.0 | 0 |
| 887.0 | 0 |
| 886.0 | 0 |
| 885.0 | 0 |
| 884.0 | 0 |
| 883.0 | 0 |
| 882.0 | 0 |
| 881.0 | 0 |
| 880.0 | 0 |
| 879.0 | 0 |
| 878.0 | 0 |
| 877.0 | 0 |
| 876.0 | 0 |
| 875.0 | 0 |
| 874.0 | 0 |
| 873.0 | 0 |
| 872.0 | 0 |
| 871.0 | 0 |
| 870.0 | 0 |
| 869.0 | 0 |
| 868.0 | 0 |
| 867.0 | 0.001 |
| 866.0 | 0 |
| 865.0 | 0.001 |
| 864.0 | 0 |
| 863.0 | 0.001 |
| 862.0 | 0.001 |
| 861.0 | 0.001 |
| 860.0 | 0.001 |
| 859.0 | 0.001 |
| 858.0 | 0.001 |
| 857.0 | 0.001 |
| 856.0 | 0.001 |
| 855.0 | 0.001 |
| 854.0 | 0.001 |
| 853.0 | 0.001 |
| 852.0 | 0.001 |
| 851.0 | 0.001 |
| 850.0 | 0.001 |
| 849.0 | 0.001 |
| 848.0 | 0.001 |
| 847.0 | 0.001 |
| 846.0 | 0.001 |
| 845.0 | 0.001 |
| 844.0 | 0.001 |
| 843.0 | 0.001 |
| 842.0 | 0.001 |
| 841.0 | 0.001 |
| 840.0 | 0.001 |
| 839.0 | 0.001 |
| 838.0 | 0.001 |
| 837.0 | 0.001 |
| 836.0 | 0.001 |
| 835.0 | 0.001 |
| 834.0 | 0.001 |
| 833.0 | 0.001 |
| 832.0 | 0.001 |
| 831.0 | 0.001 |
| 830.0 | 0.001 |
| 829.0 | 0.001 |
| 828.0 | 0.002 |
| 827.0 | 0.001 |
| 826.0 | 0.001 |
| 825.0 | 0.001 |
| 824.0 | 0.001 |
| 823.0 | 0.001 |
| 822.0 | 0.002 |
| 821.0 | 0.002 |
| 820.0 | 0.002 |
| 819.0 | 0.001 |
| 818.0 | 0.002 |
| 817.0 | 0.001 |
| 816.0 | 0.002 |
| 815.0 | 0.002 |
| 814.0 | 0.002 |
| 813.0 | 0.001 |
| 812.0 | 0.002 |
| 811.0 | 0.002 |
| 810.0 | 0.001 |
| 809.0 | 0.002 |
| 808.0 | 0.002 |
| 807.0 | 0.002 |
| 806.0 | 0.002 |
| 805.0 | 0.002 |
| 804.0 | 0.002 |
| 803.0 | 0.002 |
| 802.0 | 0.003 |
| 801.0 | 0.002 |
| 800.0 | 0.003 |
| 799.0 | 0 |
| 798.0 | 0 |
| 797.0 | 0 |
| 796.0 | 0 |
| 795.0 | 0 |
| 794.0 | 0 |
| 793.0 | 0 |
| 792.0 | 0 |
| 791.0 | 0 |
| 790.0 | 0 |
| 789.0 | 0 |
| 788.0 | 0 |
| 787.0 | 0 |
| 786.0 | 0 |
| 785.0 | 0 |
| 784.0 | 0 |
| 783.0 | 0 |
| 782.0 | 0 |
| 781.0 | 0 |
| 780.0 | 0 |
| 779.0 | 0 |
| 778.0 | 0 |
| 777.0 | 0 |
| 776.0 | 0 |
| 775.0 | 0 |
| 774.0 | 0 |
| 773.0 | 0 |
| 772.0 | 0 |
| 771.0 | 0 |
| 770.0 | 0 |
| 769.0 | 0 |
| 768.0 | 0 |
| 767.0 | 0 |
| 766.0 | 0 |
| 765.0 | 0 |
| 764.0 | 0 |
| 763.0 | 0 |
| 762.0 | 0 |
| 761.0 | 0 |
| 760.0 | 0 |
| 759.0 | 0 |
| 758.0 | 0 |
| 757.0 | 0 |
| 756.0 | 0 |
| 755.0 | 0 |
| 754.0 | 0 |
| 753.0 | 0 |
| 752.0 | 0 |
| 751.0 | 0 |
| 750.0 | 0 |
| 749.0 | 0 |
| 748.0 | 0 |
| 747.0 | 0 |
| 746.0 | 0 |
| 745.0 | 0 |
| 744.0 | 0 |
| 743.0 | 0 |
| 742.0 | 0 |
| 741.0 | 0 |
| 740.0 | 0 |
| 739.0 | 0 |
| 738.0 | 0 |
| 737.0 | 0 |
| 736.0 | 0 |
| 735.0 | 0 |
| 734.0 | 0 |
| 733.0 | 0 |
| 732.0 | 0 |
| 731.0 | 0 |
| 730.0 | 0 |
| 729.0 | 0 |
| 728.0 | 0 |
| 727.0 | 0 |
| 726.0 | 0 |
| 725.0 | 0 |
| 724.0 | 0 |
| 723.0 | 0 |
| 722.0 | 0 |
| 721.0 | 0 |
| 720.0 | 0 |
| 719.0 | 0 |
| 718.0 | 0 |
| 717.0 | 0 |
| 716.0 | 0 |
| 715.0 | 0 |
| 714.0 | 0 |
| 713.0 | 0 |
| 712.0 | 0 |
| 711.0 | 0 |
| 710.0 | 0 |
| 709.0 | 0 |
| 708.0 | 0 |
| 707.0 | 0 |
| 706.0 | 0 |
| 705.0 | 0 |
| 704.0 | 0 |
| 703.0 | 0 |
| 702.0 | 0 |
| 701.0 | 0 |
| 700.0 | 0 |
| 699.0 | 0 |
| 698.0 | 0 |
| 697.0 | 0 |
| 696.0 | 0 |
| 695.0 | 0 |
| 694.0 | 0 |
| 693.0 | 0 |
| 692.0 | 0 |
| 691.0 | 0 |
| 690.0 | 0 |
| 689.0 | 0 |
| 688.0 | 0 |
| 687.0 | 0 |
| 686.0 | 0 |
| 685.0 | 0 |
| 684.0 | 0 |
| 683.0 | 0 |
| 682.0 | 0 |
| 681.0 | 0 |
| 680.0 | 0 |
| 679.0 | 0 |
| 678.0 | 0 |
| 677.0 | 0 |
| 676.0 | 0 |
| 675.0 | 0 |
| 674.0 | 0 |
| 673.0 | 0 |
| 672.0 | 0 |
| 671.0 | 0 |
| 670.0 | 0 |
| 669.0 | 0 |
| 668.0 | 0 |
| 667.0 | 0 |
| 666.0 | 0 |
| 665.0 | 0 |
| 664.0 | 0 |
| 663.0 | 0 |
| 662.0 | 0 |
| 661.0 | 0 |
| 660.0 | 0 |
| 659.0 | 0 |
| 658.0 | 0 |
| 657.0 | 0 |
| 656.0 | 0 |
| 655.0 | 0 |
| 654.0 | 0 |
| 653.0 | 0 |
| 652.0 | 0 |
| 651.0 | 0 |
| 650.0 | 0 |
| 649.0 | 0 |
| 648.0 | 0 |
| 647.0 | 0 |
| 646.0 | 0 |
| 645.0 | 0 |
| 644.0 | 0 |
| 643.0 | 0 |
| 642.0 | 0 |
| 641.0 | 0 |
| 640.0 | 0 |
| 639.0 | 0 |
| 638.0 | 0 |
| 637.0 | 0 |
| 636.0 | 0 |
| 635.0 | 0 |
| 634.0 | 0 |
| 633.0 | 0 |
| 632.0 | 0 |
| 631.0 | 0 |
| 630.0 | 0 |
| 629.0 | 0 |
| 628.0 | 0 |
| 627.0 | 0 |
| 626.0 | 0.001 |
| 625.0 | 0.001 |
| 624.0 | 0.001 |
| 623.0 | 0 |
| 622.0 | 0 |
| 621.0 | 0 |
| 620.0 | 0 |
| 619.0 | 0 |
| 618.0 | 0 |
| 617.0 | 0 |
| 616.0 | 0 |
| 615.0 | 0 |
| 614.0 | 0 |
| 613.0 | 0 |
| 612.0 | 0 |
| 611.0 | 0 |
| 610.0 | 0 |
| 609.0 | 0 |
| 608.0 | 0 |
| 607.0 | 0 |
| 606.0 | 0 |
| 605.0 | 0 |
| 604.0 | 0 |
| 603.0 | 0 |
| 602.0 | 0 |
| 601.0 | 0 |
| 600.0 | 0 |
| 599.0 | 0 |
| 598.0 | 0 |
| 597.0 | 0 |
| 596.0 | 0 |
| 595.0 | 0 |
| 594.0 | 0 |
| 593.0 | 0 |
| 592.0 | 0 |
| 591.0 | 0 |
| 590.0 | 0 |
| 589.0 | 0 |
| 588.0 | 0 |
| 587.0 | 0 |
| 586.0 | 0 |
| 585.0 | 0 |
| 584.0 | 0 |
| 583.0 | 0 |
| 582.0 | 0 |
| 581.0 | 0 |
| 580.0 | 0 |
| 579.0 | 0 |
| 578.0 | 0 |
| 577.0 | 0 |
| 576.0 | 0 |
| 575.0 | 0 |
| 574.0 | 0 |
| 573.0 | 0 |
| 572.0 | 0 |
| 571.0 | 0 |
| 570.0 | 0 |
| 569.0 | 0 |
| 568.0 | 0 |
| 567.0 | 0 |
| 566.0 | 0 |
| 565.0 | 0 |
| 564.0 | 0 |
| 563.0 | 0 |
| 562.0 | 0 |
| 561.0 | 0 |
| 560.0 | 0 |
| 559.0 | 0 |
| 558.0 | 0 |
| 557.0 | 0 |
| 556.0 | 0 |
| 555.0 | 0 |
| 554.0 | 0 |
| 553.0 | 0 |
| 552.0 | 0 |
| 551.0 | 0 |
| 550.0 | 0 |
| 549.0 | 0 |
| 548.0 | 0 |
| 547.0 | 0 |
| 546.0 | 0 |
| 545.0 | 0 |
| 544.0 | 0 |
| 543.0 | 0 |
| 542.0 | 0 |
| 541.0 | 0 |
| 540.0 | 0 |
| 539.0 | 0 |
| 538.0 | 0 |
| 537.0 | 0 |
| 536.0 | 0 |
| 535.0 | 0 |
| 534.0 | 0 |
| 533.0 | 0 |
| 532.0 | 0 |
| 531.0 | 0 |
| 530.0 | 0 |
| 529.0 | 0 |
| 528.0 | 0 |
| 527.0 | 0 |
| 526.0 | 0 |
| 525.0 | 0 |
| 524.0 | 0 |
| 523.0 | 0 |
| 522.0 | 0 |
| 521.0 | 0 |
| 520.0 | 0 |
| 519.0 | 0 |
| 518.0 | 0 |
| 517.0 | 0 |
| 516.0 | 0 |
| 515.0 | 0 |
| 514.0 | 0 |
| 513.0 | 0 |
| 512.0 | 0 |
| 511.0 | 0 |
| 510.0 | 0 |
| 509.0 | 0 |
| 508.0 | 0 |
| 507.0 | 0 |
| 506.0 | 0 |
| 505.0 | 0 |
| 504.0 | 0 |
| 503.0 | 0 |
| 502.0 | 0 |
| 501.0 | 0 |
| 500.0 | 0 |
| 499.0 | 0 |
| 498.0 | 0 |
| 497.0 | 0 |
| 496.0 | 0 |
| 495.0 | 0 |
| 494.0 | 0 |
| 493.0 | 0 |
| 492.0 | 0 |
| 491.0 | 0 |
| 490.0 | 0 |
| 489.0 | 0 |
| 488.0 | 0 |
| 487.0 | 0 |
| 486.0 | 0 |
| 485.0 | 0 |
| 484.0 | 0 |
| 483.0 | 0 |
| 482.0 | 0 |
| 481.0 | 0 |
| 480.0 | 0 |
| 479.0 | 0 |
| 478.0 | 0 |
| 477.0 | 0 |
| 476.0 | 0 |
| 475.0 | 0 |
| 474.0 | 0 |
| 473.0 | 0 |
| 472.0 | 0 |
| 471.0 | 0 |
| 470.0 | 0 |
| 469.0 | 0 |
| 468.0 | 0 |
| 467.0 | 0 |
| 466.0 | 0 |
| 465.0 | 0 |
| 464.0 | 0 |
| 463.0 | 0 |
| 462.0 | 0.001 |
| 461.0 | 0.001 |
| 460.0 | 0.001 |
| 459.0 | 0.001 |
| 458.0 | 0.001 |
| 457.0 | 0.001 |
| 456.0 | 0.001 |
| 455.0 | 0.002 |
| 454.0 | 0.002 |
| 453.0 | 0.002 |
| 452.0 | 0.003 |
| 451.0 | 0.003 |
| 450.0 | 0.003 |
| 449.0 | 0.004 |
| 448.0 | 0.004 |
| 447.0 | 0.005 |
| 446.0 | 0.006 |
| 445.0 | 0.007 |
| 444.0 | 0.009 |
| 443.0 | 0.011 |
| 442.0 | 0.013 |
| 441.0 | 0.017 |
| 440.0 | 0.022 |
| 439.0 | 0.028 |
| 438.0 | 0.038 |
| 437.0 | 0.053 |
| 436.0 | 0.075 |
| 435.0 | 0.109 |
| 434.0 | 0.166 |
| 433.0 | 0.262 |
| 432.0 | 0.435 |
| 431.0 | 0.769 |
| 430.0 | 1.447 |
| 429.0 | 2.936 |
| 428.0 | 6.322 |
| 427.0 | 13.126 |
| 426.0 | 23.882 |
| 425.0 | 35.383 |
| 424.0 | 43.046 |
| 423.0 | 46.077 |
| 422.0 | 46.666 |
| 421.0 | 46.459 |
| 420.0 | 45.985 |
| 419.0 | 44.621 |
| 418.0 | 39.824 |
| 417.0 | 29.681 |
| 416.0 | 17.225 |
| 415.0 | 7.855 |
| 414.0 | 3.249 |
| 413.0 | 1.366 |
| 412.0 | 0.624 |
| 411.0 | 0.309 |
| 410.0 | 0.164 |
| 409.0 | 0.092 |
| 408.0 | 0.053 |
| 407.0 | 0.032 |
| 406.0 | 0.02 |
| 405.0 | 0.013 |
| 404.0 | 0.009 |
| 403.0 | 0.006 |
| 402.0 | 0.004 |
| 401.0 | 0.003 |
| 400.0 | 0.002 |
| 399.0 | 0.002 |
| 398.0 | 0.001 |
| 397.0 | 0.001 |
| 396.0 | 0.001 |
| 395.0 | 0.001 |
| 394.0 | 0.001 |
| 393.0 | 0 |
| 392.0 | 0 |
| 391.0 | 0 |
| 390.0 | 0 |
| 389.0 | 0 |
| 388.0 | 0 |
| 387.0 | 0 |
| 386.0 | 0 |
| 385.0 | 0 |
| 384.0 | 0 |
| 383.0 | 0 |
| 382.0 | 0 |
| 381.0 | 0 |
| 380.0 | 0 |
| 379.0 | 0 |
| 378.0 | 0 |
| 377.0 | 0 |
| 376.0 | 0 |
| 375.0 | 0 |
| 374.0 | 0 |
| 373.0 | 0 |
| 372.0 | 0 |
| 371.0 | 0 |
| 370.0 | 0 |
| 369.0 | 0 |
| 368.0 | 0 |
| 367.0 | 0 |
| 366.0 | 0 |
| 365.0 | 0 |
| 364.0 | 0 |
| 363.0 | 0 |
| 362.0 | 0 |
| 361.0 | 0 |
| 360.0 | 0 |
| 359.0 | 0 |
| 358.0 | 0 |
| 357.0 | 0 |
| 356.0 | 0 |
| 355.0 | 0 |
| 354.0 | 0 |
| 353.0 | 0 |
| 352.0 | 0 |
| 351.0 | 0 |
| 350.0 | 0 |
| 349.0 | 0 |
| 348.0 | 0 |
| 347.0 | 0 |
| 346.0 | 0 |
| 345.0 | 0 |
| 344.0 | 0 |
| 343.0 | 0 |
| 342.0 | 0 |
| 341.0 | 0 |
| 340.0 | 0 |
| 339.0 | 0 |
| 338.0 | 0 |
| 337.0 | 0 |
| 336.0 | 0 |
| 335.0 | 0 |
| 334.0 | 0 |
| 333.0 | 0 |
| 332.0 | 0 |
| 331.0 | 0 |
| 330.0 | 0 |
| 329.0 | 0 |
| 328.0 | 0 |
| 327.0 | 0 |
| 326.0 | 0 |
| 325.0 | 0 |
| 324.0 | 0 |
| 323.0 | 0 |
| 322.0 | 0 |
| 321.0 | 0 |
| 320.0 | 0 |
| 319.0 | 0 |
| 318.0 | 0 |
| 317.0 | 0 |
| 316.0 | 0 |
| 315.0 | 0 |
| 314.0 | 0 |
| 313.0 | 0 |
| 312.0 | 0 |
| 311.0 | 0 |
| 310.0 | 0 |
| 309.0 | 0 |
| 308.0 | 0 |
| 307.0 | 0 |
| 306.0 | 0 |
| 305.0 | 0 |
| 304.0 | 0 |
| 303.0 | 0 |
| 302.0 | 0 |
| 301.0 | 0 |
| 300.0 | 0 |
| 299.0 | 0 |
| 298.0 | 0 |
| 297.0 | 0 |
| 296.0 | 0 |
| 295.0 | 0 |
| 294.0 | 0 |
| 293.0 | 0 |
| 292.0 | 0 |
| 291.0 | 0 |
| 290.0 | 0 |
| 289.0 | 0 |
| 288.0 | 0 |
| 287.0 | 0 |
| 286.0 | 0 |
| 285.0 | 0 |
| 284.0 | 0 |
| 283.0 | 0 |
| 282.0 | 0 |
| 281.0 | 0 |
| 280.0 | 0 |
| 279.0 | 0 |
| 278.0 | 0 |
| 277.0 | 0 |
| 276.0 | 0 |
| 275.0 | 0 |
| 274.0 | 0 |
| 273.0 | 0 |
| 272.0 | 0 |
| 271.0 | 0 |
| 270.0 | 0 |
| 269.0 | 0 |
| 268.0 | 0 |
| 267.0 | 0 |
| 266.0 | 0 |
| 265.0 | 0 |
| 264.0 | 0 |
| 263.0 | 0 |
| 262.0 | 0 |
| 261.0 | 0 |
| 260.0 | 0 |
| 259.0 | 0 |
| 258.0 | 0 |
| 257.0 | 0 |
| 256.0 | 0 |
| 255.0 | 0 |
| 254.0 | 0 |
| 253.0 | 0 |
| 252.0 | 0 |
| 251.0 | 0 |
| 250.0 | 0 |
| 249.0 | 0 |
| 248.0 | 0 |
| 247.0 | 0 |
| 246.0 | 0 |
| 245.0 | 0 |
| 244.0 | 0 |
| 243.0 | 0 |
| 242.0 | 0 |
| 241.0 | 0 |
| 240.0 | 0 |
| 239.0 | 0 |
| 238.0 | 0 |
| 237.0 | 0 |
| 236.0 | 0 |
| 235.0 | 0 |
| 234.0 | 0 |
| 233.0 | 0 |
| 232.0 | 0 |
| 231.0 | 0 |
| 230.0 | 0 |
| 229.0 | 0 |
| 228.0 | 0 |
| 227.0 | 0 |
| 226.0 | 0 |
| 225.0 | 0 |
| 224.0 | 0 |
| 223.0 | 0 |
| 222.0 | 0 |
| 221.0 | 0 |
| 220.0 | 0 |
| 219.0 | 0 |
| 218.0 | 0 |
| 217.0 | 0 |
| 216.0 | 0 |
| 215.0 | 0 |
| 214.0 | 0 |
| 213.0 | 0 |
| 212.0 | 0 |
| 211.0 | 0 |
| 210.0 | 0 |
| 209.0 | 0 |
| 208.0 | 0 |
| 207.0 | 0 |
| 206.0 | 0 |
| 205.0 | 0 |
| 204.0 | 0 |
| 203.0 | 0 |
| 202.0 | 0 |
| 201.0 | 0 |